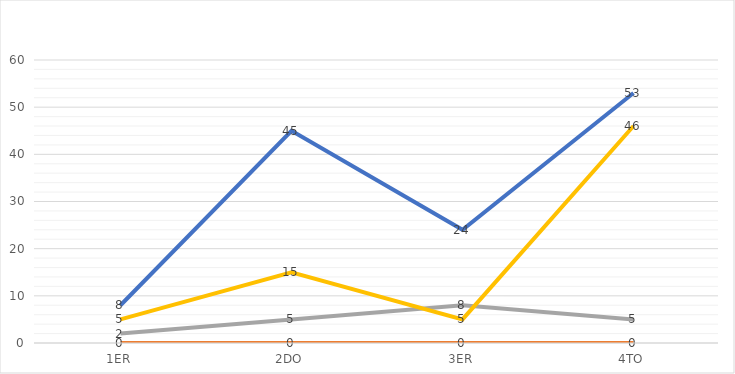
| Category | Correo Electrónico  | WhatsApp  | Saip | Teléfono |
|---|---|---|---|---|
| 1ER | 8 | 0 | 2 | 5 |
| 2DO | 45 | 0 | 5 | 15 |
| 3ER | 24 | 0 | 8 | 5 |
| 4TO | 53 | 0 | 5 | 46 |